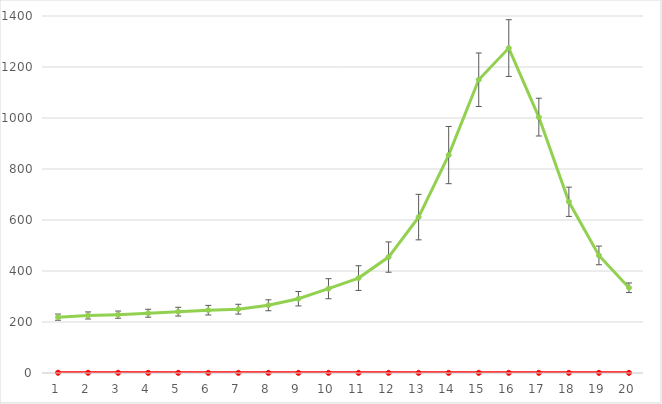
| Category | SMC3 | FISH |
|---|---|---|
| 0 | 1 | 218.966 |
| 1 | 0.849 | 225.593 |
| 2 | 0.688 | 228.849 |
| 3 | 0.609 | 234.383 |
| 4 | 0.571 | 240.585 |
| 5 | 0.563 | 246.368 |
| 6 | 0.581 | 250.222 |
| 7 | 0.59 | 265.619 |
| 8 | 0.597 | 291.36 |
| 9 | 0.604 | 330.585 |
| 10 | 0.605 | 372.268 |
| 11 | 0.591 | 454.554 |
| 12 | 0.587 | 611.359 |
| 13 | 0.605 | 854.623 |
| 14 | 0.646 | 1150.069 |
| 15 | 0.679 | 1274.223 |
| 16 | 0.647 | 1003.508 |
| 17 | 0.567 | 671.492 |
| 18 | 0.53 | 461.091 |
| 19 | 0.5 | 334.285 |